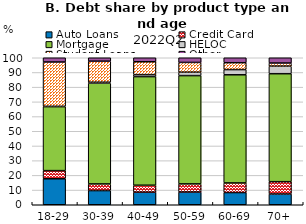
| Category | Auto Loans | Credit Card | Mortgage | HELOC | Student Loans | Other |
|---|---|---|---|---|---|---|
| 18-29 | 17.675 | 5.549 | 43.516 | 0.231 | 30.148 | 2.88 |
| 30-39 | 9.651 | 4.521 | 68.61 | 0.591 | 14.319 | 2.307 |
| 40-49 | 8.577 | 4.714 | 73.869 | 1.375 | 8.752 | 2.711 |
| 50-59 | 8.669 | 5.525 | 73.662 | 2.302 | 6.662 | 3.18 |
| 60-69 | 8.294 | 6.546 | 73.569 | 3.526 | 4.692 | 3.374 |
| 70+ | 7.338 | 8.365 | 73.451 | 5.152 | 2.121 | 3.573 |